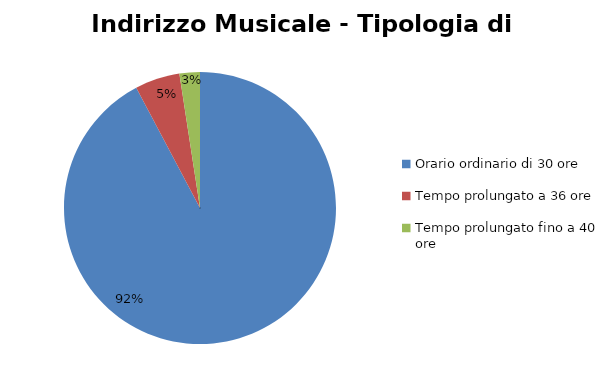
| Category | Series 0 | Series 1 |
|---|---|---|
| Orario ordinario di 30 ore | 2661 |  |
| Tempo prolungato a 36 ore | 154 |  |
| Tempo prolungato fino a 40 ore | 70 |  |